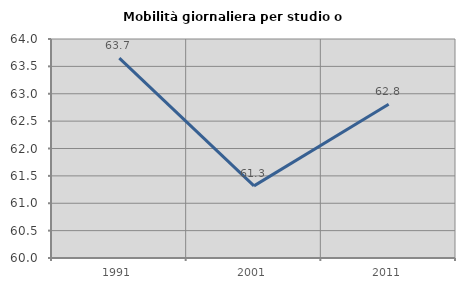
| Category | Mobilità giornaliera per studio o lavoro |
|---|---|
| 1991.0 | 63.651 |
| 2001.0 | 61.317 |
| 2011.0 | 62.81 |